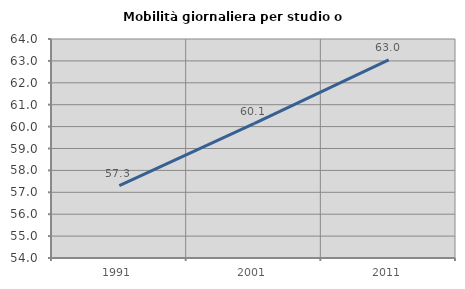
| Category | Mobilità giornaliera per studio o lavoro |
|---|---|
| 1991.0 | 57.306 |
| 2001.0 | 60.133 |
| 2011.0 | 63.047 |